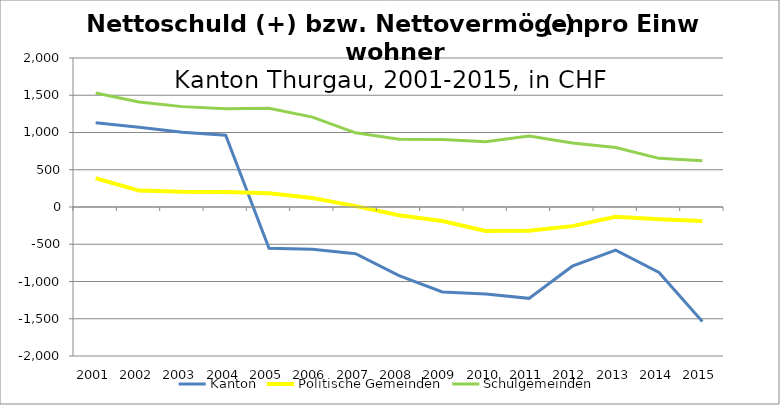
| Category | Kanton | Politische Gemeinden | Schulgemeinden |
|---|---|---|---|
| 2001.0 | 1131.953 | 386.372 | 1529.746 |
| 2002.0 | 1070.172 | 220.701 | 1409.564 |
| 2003.0 | 1001.968 | 203.486 | 1347.305 |
| 2004.0 | 964.211 | 202.68 | 1317.8 |
| 2005.0 | -555.01 | 185.729 | 1325.787 |
| 2006.0 | -567.887 | 121.661 | 1206.639 |
| 2007.0 | -626.311 | 11.37 | 995.712 |
| 2008.0 | -920.216 | -111.19 | 909.865 |
| 2009.0 | -1141.009 | -188.14 | 906.103 |
| 2010.0 | -1166.847 | -322.898 | 875.374 |
| 2011.0 | -1226.029 | -319.358 | 954.233 |
| 2012.0 | -794.638 | -256.67 | 858.524 |
| 2013.0 | -579.387 | -130.934 | 799.349 |
| 2014.0 | -879.362 | -164.101 | 653.08 |
| 2015.0 | -1537.328 | -188.99 | 621.585 |